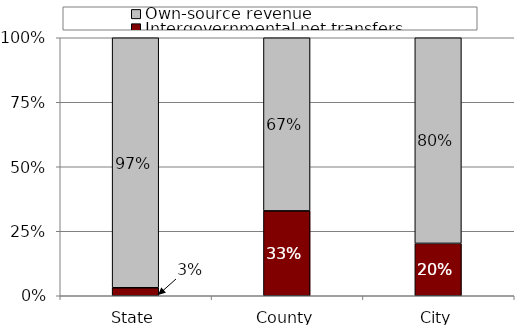
| Category | Intergovernmental net transfers | Own-source revenue |
|---|---|---|
| State | 3.1 | 96.9 |
| County | 32.9 | 67.1 |
| City | 20.3 | 79.7 |